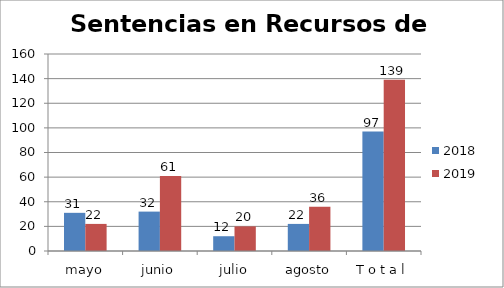
| Category | 2018 | 2019 |
|---|---|---|
| mayo | 31 | 22 |
| junio | 32 | 61 |
| julio | 12 | 20 |
| agosto | 22 | 36 |
| T o t a l | 97 | 139 |